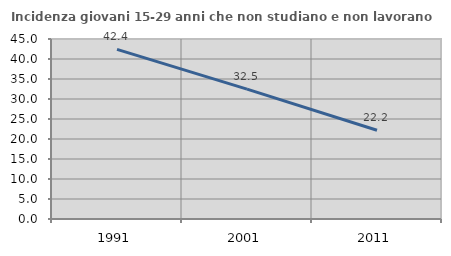
| Category | Incidenza giovani 15-29 anni che non studiano e non lavorano  |
|---|---|
| 1991.0 | 42.394 |
| 2001.0 | 32.481 |
| 2011.0 | 22.201 |